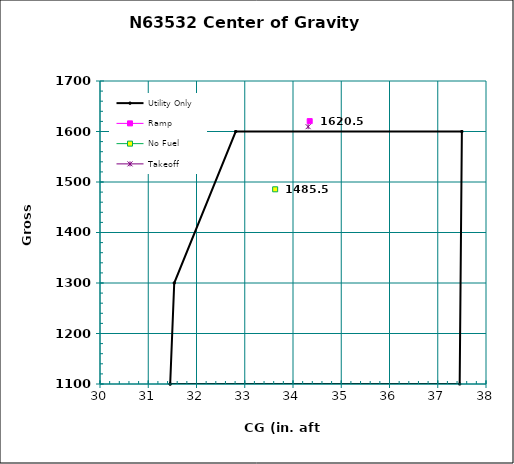
| Category | Utility Only |
|---|---|
| 31.454545454545453 | 1100 |
| 31.53846153846154 | 1300 |
| 32.8125 | 1600 |
| 37.5 | 1600 |
| 37.45454545454545 | 1100 |
| 31.454545454545453 | 1100 |